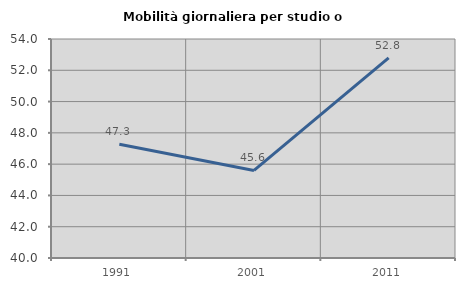
| Category | Mobilità giornaliera per studio o lavoro |
|---|---|
| 1991.0 | 47.274 |
| 2001.0 | 45.596 |
| 2011.0 | 52.792 |